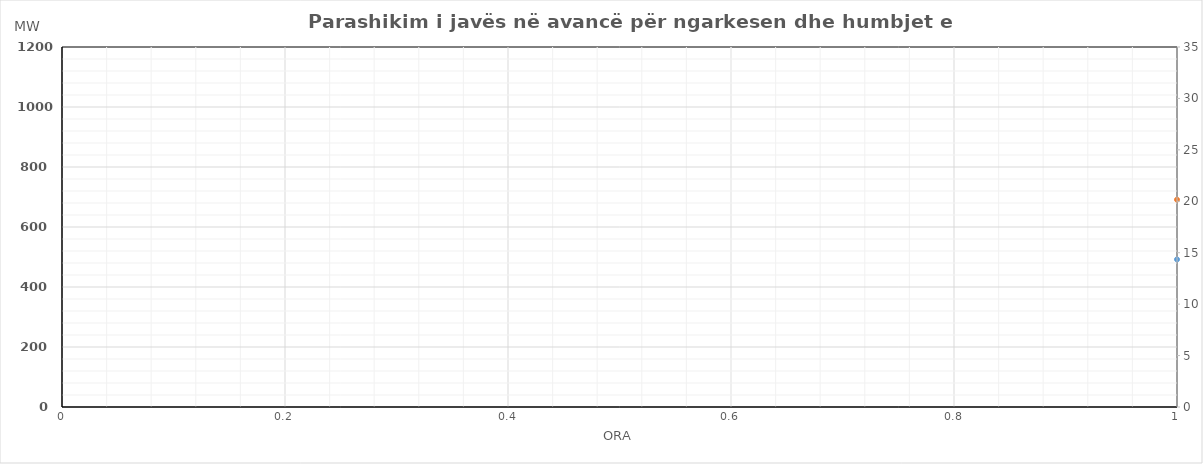
| Category | Ngarkesa (MWh) |
|---|---|
| 0 | 691.072 |
| 1 | 634.246 |
| 2 | 603.862 |
| 3 | 585.499 |
| 4 | 587.706 |
| 5 | 617.99 |
| 6 | 748.126 |
| 7 | 905.189 |
| 8 | 1008.189 |
| 9 | 1055.04 |
| 10 | 1094.387 |
| 11 | 1117.675 |
| 12 | 1127.535 |
| 13 | 1142.359 |
| 14 | 1131.544 |
| 15 | 1099.795 |
| 16 | 1097.928 |
| 17 | 1103.55 |
| 18 | 1090.807 |
| 19 | 1056.696 |
| 20 | 1065.317 |
| 21 | 1071.004 |
| 22 | 968.125 |
| 23 | 809.757 |
| 24 | 699.547 |
| 25 | 627.347 |
| 26 | 599.587 |
| 27 | 581.888 |
| 28 | 581.103 |
| 29 | 613.227 |
| 30 | 746.251 |
| 31 | 893.49 |
| 32 | 995.636 |
| 33 | 1049.598 |
| 34 | 1072.998 |
| 35 | 1089.608 |
| 36 | 1105.128 |
| 37 | 1131.826 |
| 38 | 1122.398 |
| 39 | 1102.942 |
| 40 | 1099.828 |
| 41 | 1105.738 |
| 42 | 1078.613 |
| 43 | 1049.361 |
| 44 | 1057.579 |
| 45 | 1060.379 |
| 46 | 970.059 |
| 47 | 787.51 |
| 48 | 666.294 |
| 49 | 606.445 |
| 50 | 575.107 |
| 51 | 559.99 |
| 52 | 559.561 |
| 53 | 591.149 |
| 54 | 734.656 |
| 55 | 884.731 |
| 56 | 986.373 |
| 57 | 1036.934 |
| 58 | 1060.567 |
| 59 | 1097.702 |
| 60 | 1106.921 |
| 61 | 1123.416 |
| 62 | 1111.87 |
| 63 | 1092.17 |
| 64 | 1088.383 |
| 65 | 1089.733 |
| 66 | 1086.965 |
| 67 | 1051.386 |
| 68 | 1062.516 |
| 69 | 1055.424 |
| 70 | 961.985 |
| 71 | 814.776 |
| 72 | 688.54 |
| 73 | 628.745 |
| 74 | 605.022 |
| 75 | 589.397 |
| 76 | 594.276 |
| 77 | 625.747 |
| 78 | 720.746 |
| 79 | 847.739 |
| 80 | 952.473 |
| 81 | 995.676 |
| 82 | 1009.799 |
| 83 | 1039.156 |
| 84 | 1052.052 |
| 85 | 1067.574 |
| 86 | 1054.956 |
| 87 | 1039.108 |
| 88 | 1035.288 |
| 89 | 1040.884 |
| 90 | 1030.926 |
| 91 | 1002.111 |
| 92 | 1016.597 |
| 93 | 1028.986 |
| 94 | 929.753 |
| 95 | 783.953 |
| 96 | 675.294 |
| 97 | 600.445 |
| 98 | 569.107 |
| 99 | 553.99 |
| 100 | 553.561 |
| 101 | 585.149 |
| 102 | 728.656 |
| 103 | 878.731 |
| 104 | 980.373 |
| 105 | 1030.934 |
| 106 | 1054.567 |
| 107 | 1091.702 |
| 108 | 1100.921 |
| 109 | 1117.416 |
| 110 | 1105.87 |
| 111 | 1086.17 |
| 112 | 1082.383 |
| 113 | 1083.733 |
| 114 | 1080.965 |
| 115 | 1045.386 |
| 116 | 1056.516 |
| 117 | 1049.424 |
| 118 | 955.985 |
| 119 | 808.776 |
| 120 | 691.072 |
| 121 | 634.246 |
| 122 | 603.862 |
| 123 | 585.499 |
| 124 | 587.706 |
| 125 | 617.99 |
| 126 | 748.126 |
| 127 | 905.189 |
| 128 | 1008.189 |
| 129 | 1055.04 |
| 130 | 1094.387 |
| 131 | 1117.675 |
| 132 | 1127.535 |
| 133 | 1142.359 |
| 134 | 1131.544 |
| 135 | 1099.795 |
| 136 | 1097.928 |
| 137 | 1103.55 |
| 138 | 1090.807 |
| 139 | 1056.696 |
| 140 | 1065.317 |
| 141 | 1071.004 |
| 142 | 968.125 |
| 143 | 809.757 |
| 144 | 699.547 |
| 145 | 627.347 |
| 146 | 599.587 |
| 147 | 581.888 |
| 148 | 581.103 |
| 149 | 613.227 |
| 150 | 746.251 |
| 151 | 893.49 |
| 152 | 995.636 |
| 153 | 1049.598 |
| 154 | 1072.998 |
| 155 | 1089.608 |
| 156 | 1105.128 |
| 157 | 1131.826 |
| 158 | 1122.398 |
| 159 | 1102.942 |
| 160 | 1099.828 |
| 161 | 1105.738 |
| 162 | 1078.613 |
| 163 | 1049.361 |
| 164 | 1057.579 |
| 165 | 1060.379 |
| 166 | 970.059 |
| 167 | 787.51 |